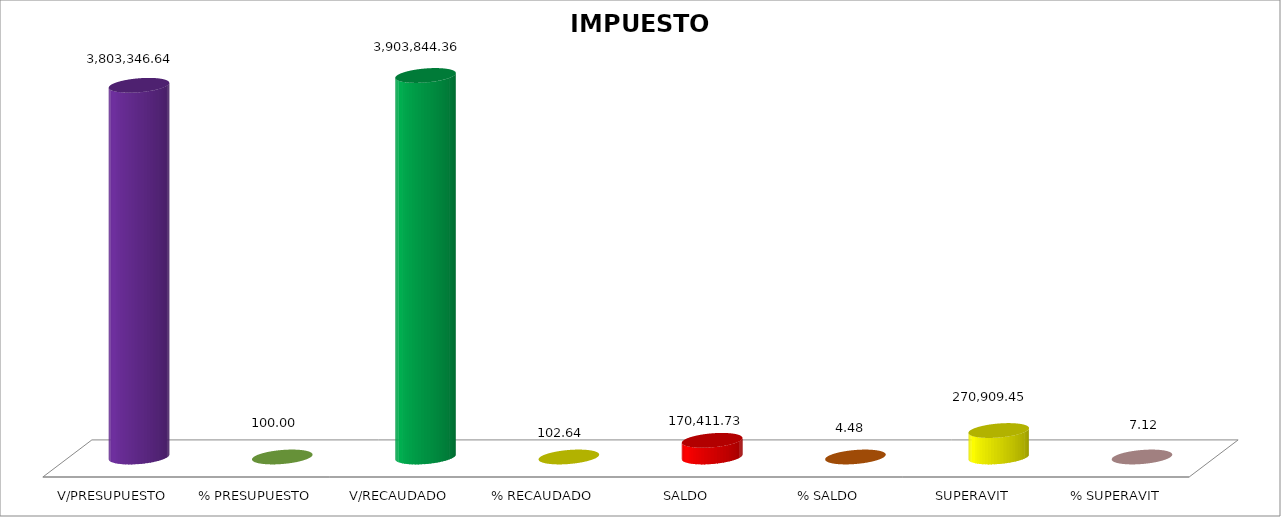
| Category | IMPUESTOS |
|---|---|
| V/PRESUPUESTO | 3803346.64 |
| % PRESUPUESTO | 100 |
| V/RECAUDADO | 3903844.36 |
| % RECAUDADO | 102.642 |
| SALDO | 170411.73 |
| % SALDO | 4.481 |
| SUPERAVIT | 270909.45 |
| % SUPERAVIT | 7.123 |